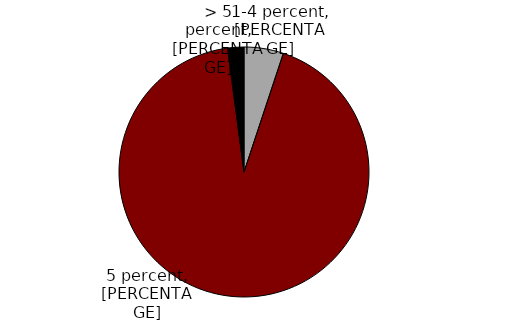
| Category | Series 0 |
|---|---|
| 1-4 percent | 0.051 |
| 5 percent | 0.928 |
| > 5 percent | 0.021 |